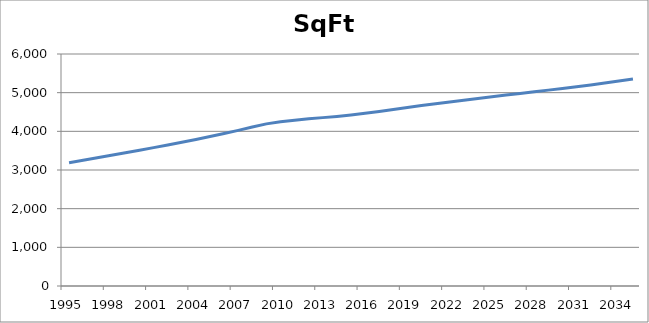
| Category | SqFt |
|---|---|
| 1995.0 | 3190.103 |
| 1996.0 | 3251.849 |
| 1997.0 | 3314.79 |
| 1998.0 | 3378.949 |
| 1999.0 | 3444.35 |
| 2000.0 | 3511.017 |
| 2001.0 | 3578.975 |
| 2002.0 | 3648.247 |
| 2003.0 | 3718.861 |
| 2004.0 | 3790.841 |
| 2005.0 | 3864.324 |
| 2006.0 | 3943.914 |
| 2007.0 | 4025.416 |
| 2008.0 | 4110.096 |
| 2009.0 | 4193.107 |
| 2010.0 | 4248.345 |
| 2011.0 | 4285.373 |
| 2012.0 | 4327.447 |
| 2013.0 | 4354.538 |
| 2014.0 | 4385.109 |
| 2015.0 | 4422.715 |
| 2016.0 | 4465.699 |
| 2017.0 | 4513.987 |
| 2018.0 | 4564.74 |
| 2019.0 | 4616.534 |
| 2020.0 | 4666.458 |
| 2021.0 | 4714.842 |
| 2022.0 | 4761.379 |
| 2023.0 | 4806.227 |
| 2024.0 | 4850.003 |
| 2025.0 | 4893.726 |
| 2026.0 | 4936.823 |
| 2027.0 | 4979.71 |
| 2028.0 | 5022.595 |
| 2029.0 | 5065.552 |
| 2030.0 | 5108.611 |
| 2031.0 | 5152.946 |
| 2032.0 | 5200.006 |
| 2033.0 | 5249.415 |
| 2034.0 | 5300.546 |
| 2035.0 | 5354.101 |